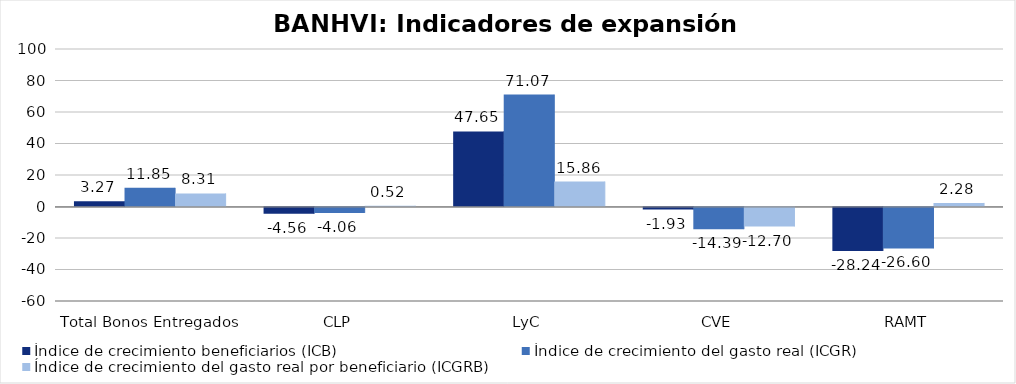
| Category | Índice de crecimiento beneficiarios (ICB)  | Índice de crecimiento del gasto real (ICGR)  | Índice de crecimiento del gasto real por beneficiario (ICGRB)  |
|---|---|---|---|
| Total Bonos Entregados | 3.266 | 11.848 | 8.31 |
| CLP | -4.563 | -4.063 | 0.524 |
| LyC | 47.649 | 71.066 | 15.859 |
| CVE | -1.935 | -14.39 | -12.7 |
| RAMT | -28.238 | -26.599 | 2.284 |